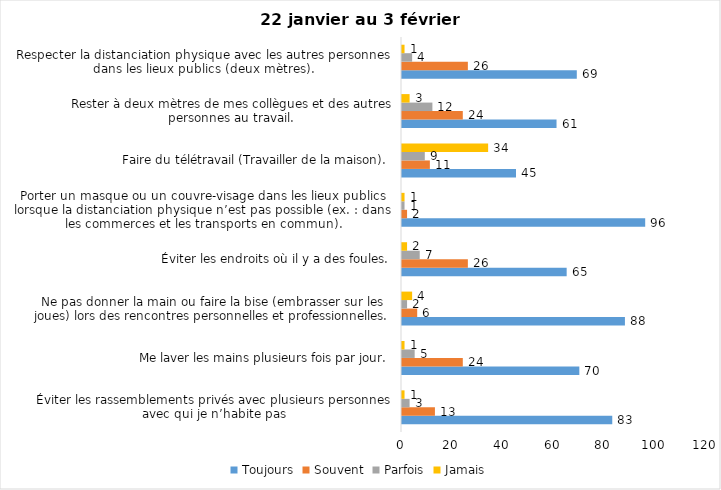
| Category | Toujours | Souvent | Parfois | Jamais |
|---|---|---|---|---|
| Éviter les rassemblements privés avec plusieurs personnes avec qui je n’habite pas | 83 | 13 | 3 | 1 |
| Me laver les mains plusieurs fois par jour. | 70 | 24 | 5 | 1 |
| Ne pas donner la main ou faire la bise (embrasser sur les joues) lors des rencontres personnelles et professionnelles. | 88 | 6 | 2 | 4 |
| Éviter les endroits où il y a des foules. | 65 | 26 | 7 | 2 |
| Porter un masque ou un couvre-visage dans les lieux publics lorsque la distanciation physique n’est pas possible (ex. : dans les commerces et les transports en commun). | 96 | 2 | 1 | 1 |
| Faire du télétravail (Travailler de la maison). | 45 | 11 | 9 | 34 |
| Rester à deux mètres de mes collègues et des autres personnes au travail. | 61 | 24 | 12 | 3 |
| Respecter la distanciation physique avec les autres personnes dans les lieux publics (deux mètres). | 69 | 26 | 4 | 1 |